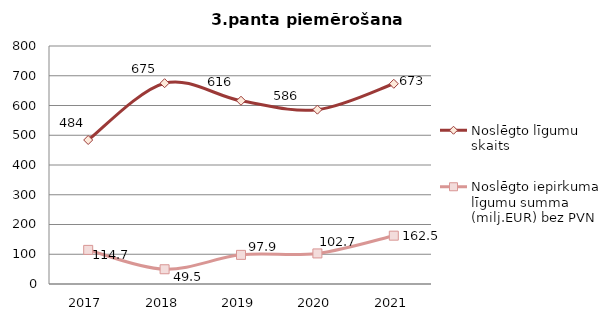
| Category | Noslēgto līgumu skaits | Noslēgto iepirkuma līgumu summa (milj.EUR) bez PVN |
|---|---|---|
| 2017.0 | 484 | 114.654 |
| 2018.0 | 675 | 49.536 |
| 2019.0 | 616 | 97.928 |
| 2020.0 | 586 | 102.745 |
| 2021.0 | 673 | 162.472 |